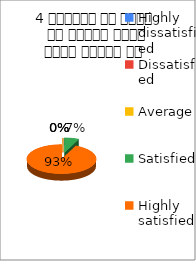
| Category | 4 शिक्षक ने विषय के प्रति रूचि रूचि जागृत की  |
|---|---|
| Highly dissatisfied | 0 |
| Dissatisfied | 0 |
| Average | 0 |
| Satisfied | 1 |
| Highly satisfied | 14 |